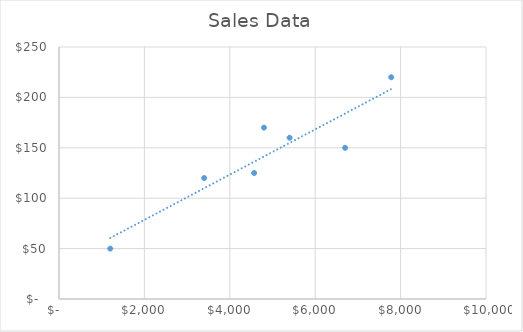
| Category | Series 0 |
|---|---|
| 6700.0 | 150 |
| 3400.0 | 120 |
| 1200.0 | 50 |
| 4570.0 | 125 |
| 7780.0 | 220 |
| 5400.0 | 160 |
| 4800.0 | 170 |